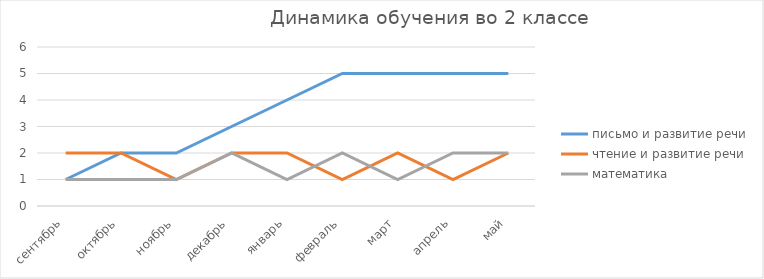
| Category | письмо и развитие речи | чтение и развитие речи | математика |
|---|---|---|---|
| сентябрь | 1 | 2 | 1 |
| октябрь | 2 | 2 | 1 |
| ноябрь | 2 | 1 | 1 |
| декабрь | 3 | 2 | 2 |
| январь | 4 | 2 | 1 |
| февраль | 5 | 1 | 2 |
| март | 5 | 2 | 1 |
| апрель | 5 | 1 | 2 |
| май | 5 | 2 | 2 |